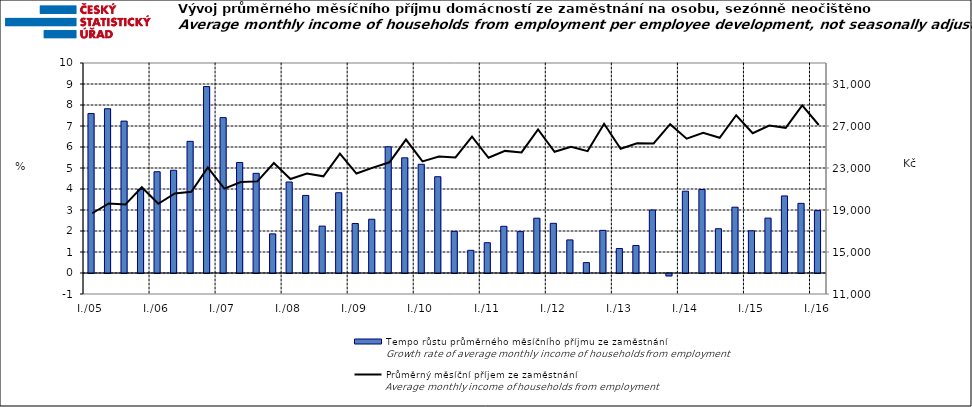
| Category | Tempo růstu průměrného měsíčního příjmu ze zaměstnání |
|---|---|
| I./05 | 7.592 |
|  | 7.822 |
|  | 7.233 |
|  | 3.981 |
| I./06 | 4.822 |
|  | 4.892 |
|  | 6.269 |
|  | 8.878 |
| I./07 | 7.399 |
|  | 5.263 |
|  | 4.746 |
|  | 1.864 |
| I./08 | 4.333 |
|  | 3.694 |
|  | 2.233 |
|  | 3.823 |
| I./09 | 2.357 |
|  | 2.56 |
|  | 6.011 |
|  | 5.485 |
| I./10 | 5.177 |
|  | 4.584 |
|  | 1.983 |
|  | 1.08 |
| I./11 | 1.442 |
|  | 2.223 |
|  | 1.972 |
|  | 2.61 |
| I./12 | 2.366 |
|  | 1.576 |
|  | 0.494 |
|  | 2.03 |
| I./13 | 1.165 |
|  | 1.311 |
|  | 3 |
|  | -0.114 |
| I./14 | 3.894 |
|  | 3.974 |
|  | 2.107 |
|  | 3.135 |
| I./15 | 2.011 |
|  | 2.613 |
|  | 3.67 |
|  | 3.317 |
| I./16 | 2.971 |